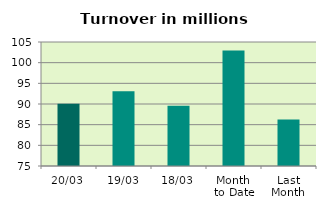
| Category | Series 0 |
|---|---|
| 20/03 | 90.087 |
| 19/03 | 93.102 |
| 18/03 | 89.588 |
| Month 
to Date | 102.931 |
| Last
Month | 86.247 |